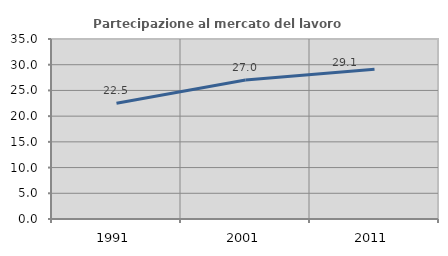
| Category | Partecipazione al mercato del lavoro  femminile |
|---|---|
| 1991.0 | 22.505 |
| 2001.0 | 27.031 |
| 2011.0 | 29.13 |